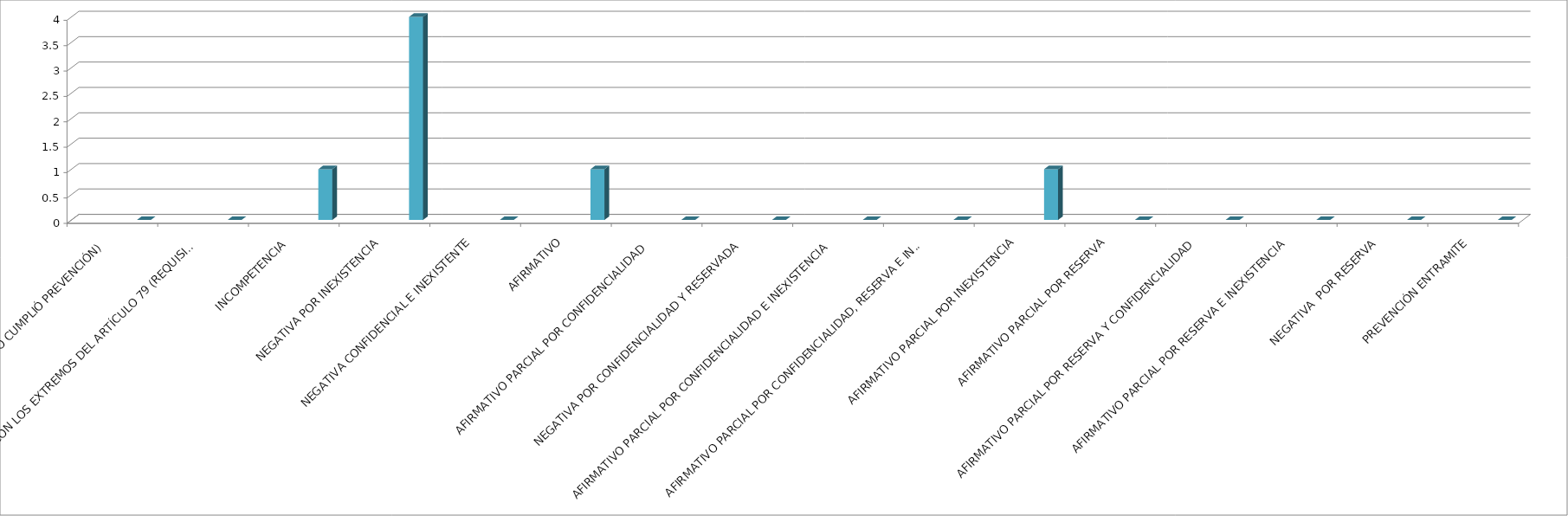
| Category | Series 0 | Series 1 | Series 2 | Series 3 | Series 4 |
|---|---|---|---|---|---|
| SE TIENE POR NO PRESENTADA ( NO CUMPLIÓ PREVENCIÓN) |  |  |  |  | 0 |
| NO CUMPLIO CON LOS EXTREMOS DEL ARTÍCULO 79 (REQUISITOS) |  |  |  |  | 0 |
| INCOMPETENCIA  |  |  |  |  | 1 |
| NEGATIVA POR INEXISTENCIA |  |  |  |  | 4 |
| NEGATIVA CONFIDENCIAL E INEXISTENTE |  |  |  |  | 0 |
| AFIRMATIVO |  |  |  |  | 1 |
| AFIRMATIVO PARCIAL POR CONFIDENCIALIDAD  |  |  |  |  | 0 |
| NEGATIVA POR CONFIDENCIALIDAD Y RESERVADA |  |  |  |  | 0 |
| AFIRMATIVO PARCIAL POR CONFIDENCIALIDAD E INEXISTENCIA |  |  |  |  | 0 |
| AFIRMATIVO PARCIAL POR CONFIDENCIALIDAD, RESERVA E INEXISTENCIA |  |  |  |  | 0 |
| AFIRMATIVO PARCIAL POR INEXISTENCIA |  |  |  |  | 1 |
| AFIRMATIVO PARCIAL POR RESERVA |  |  |  |  | 0 |
| AFIRMATIVO PARCIAL POR RESERVA Y CONFIDENCIALIDAD |  |  |  |  | 0 |
| AFIRMATIVO PARCIAL POR RESERVA E INEXISTENCIA |  |  |  |  | 0 |
| NEGATIVA  POR RESERVA |  |  |  |  | 0 |
| PREVENCIÓN ENTRAMITE |  |  |  |  | 0 |